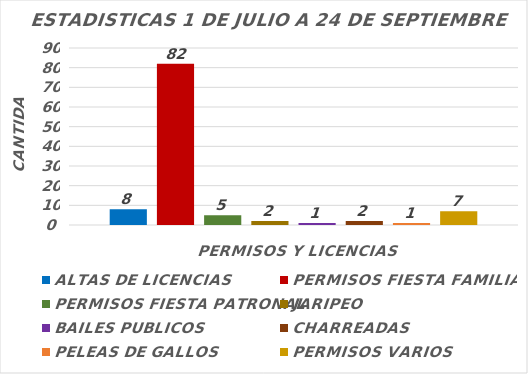
| Category | ALTAS DE LICENCIAS | PERMISOS FIESTA FAMILIAR | PERMISOS FIESTA PATRONAL | JARIPEO | BAILES PUBLICOS | CHARREADAS | PELEAS DE GALLOS | PERMISOS VARIOS |
|---|---|---|---|---|---|---|---|---|
| 0 | 8 | 82 | 5 | 2 | 1 | 2 | 1 | 7 |